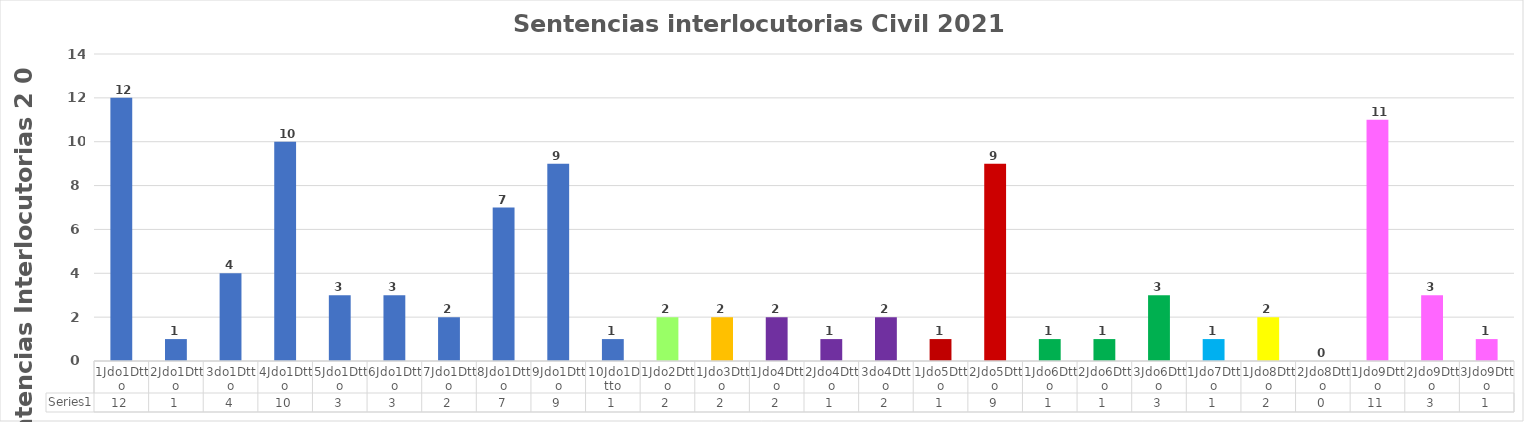
| Category | Series 0 |
|---|---|
| 1Jdo1Dtto | 12 |
| 2Jdo1Dtto | 1 |
| 3do1Dtto | 4 |
| 4Jdo1Dtto | 10 |
| 5Jdo1Dtto | 3 |
| 6Jdo1Dtto | 3 |
| 7Jdo1Dtto | 2 |
| 8Jdo1Dtto | 7 |
| 9Jdo1Dtto | 9 |
| 10Jdo1Dtto | 1 |
| 1Jdo2Dtto | 2 |
| 1Jdo3Dtto | 2 |
| 1Jdo4Dtto | 2 |
| 2Jdo4Dtto | 1 |
| 3do4Dtto | 2 |
| 1Jdo5Dtto | 1 |
| 2Jdo5Dtto | 9 |
| 1Jdo6Dtto | 1 |
| 2Jdo6Dtto | 1 |
| 3Jdo6Dtto | 3 |
| 1Jdo7Dtto | 1 |
| 1Jdo8Dtto | 2 |
| 2Jdo8Dtto | 0 |
| 1Jdo9Dtto | 11 |
| 2Jdo9Dtto | 3 |
| 3Jdo9Dtto | 1 |